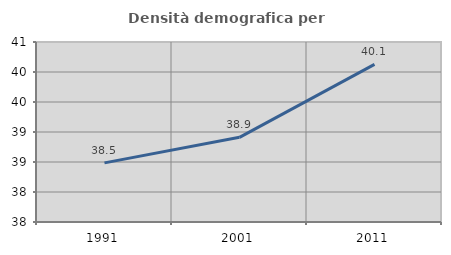
| Category | Densità demografica |
|---|---|
| 1991.0 | 38.486 |
| 2001.0 | 38.911 |
| 2011.0 | 40.126 |